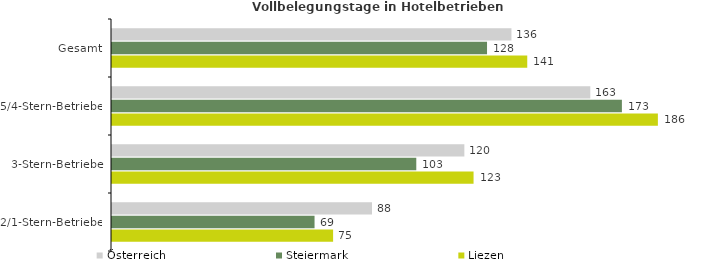
| Category | Österreich | Steiermark | Liezen |
|---|---|---|---|
| Gesamt | 135.866 | 127.561 | 141.241 |
| 5/4-Stern-Betriebe | 162.683 | 173.435 | 185.674 |
| 3-Stern-Betriebe | 119.851 | 103.499 | 122.979 |
| 2/1-Stern-Betriebe | 88.435 | 68.894 | 75.206 |